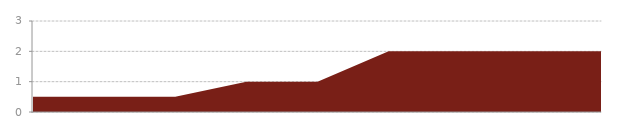
| Category | Series 0 |
|---|---|
| 0 | 0.5 |
| 1 | 0.5 |
| 2 | 0.5 |
| 3 | 1 |
| 4 | 1 |
| 5 | 2 |
| 6 | 2 |
| 7 | 2 |
| 8 | 2 |